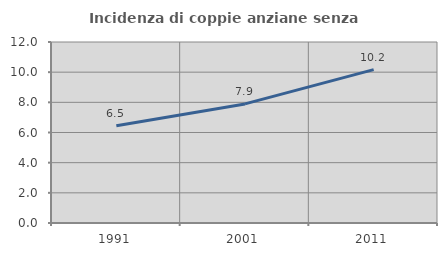
| Category | Incidenza di coppie anziane senza figli  |
|---|---|
| 1991.0 | 6.452 |
| 2001.0 | 7.895 |
| 2011.0 | 10.169 |